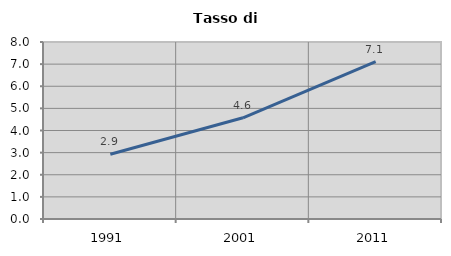
| Category | Tasso di disoccupazione   |
|---|---|
| 1991.0 | 2.925 |
| 2001.0 | 4.575 |
| 2011.0 | 7.115 |